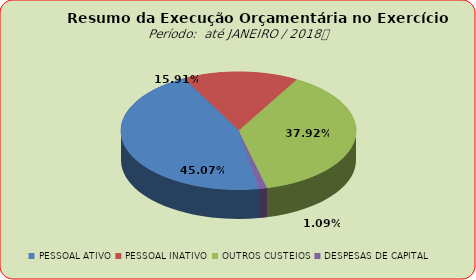
| Category | Series 0 |
|---|---|
| PESSOAL ATIVO | 15517098.53 |
| PESSOAL INATIVO | 5476709.65 |
| OUTROS CUSTEIOS | 13055929.63 |
| DESPESAS DE CAPITAL | 376852.5 |